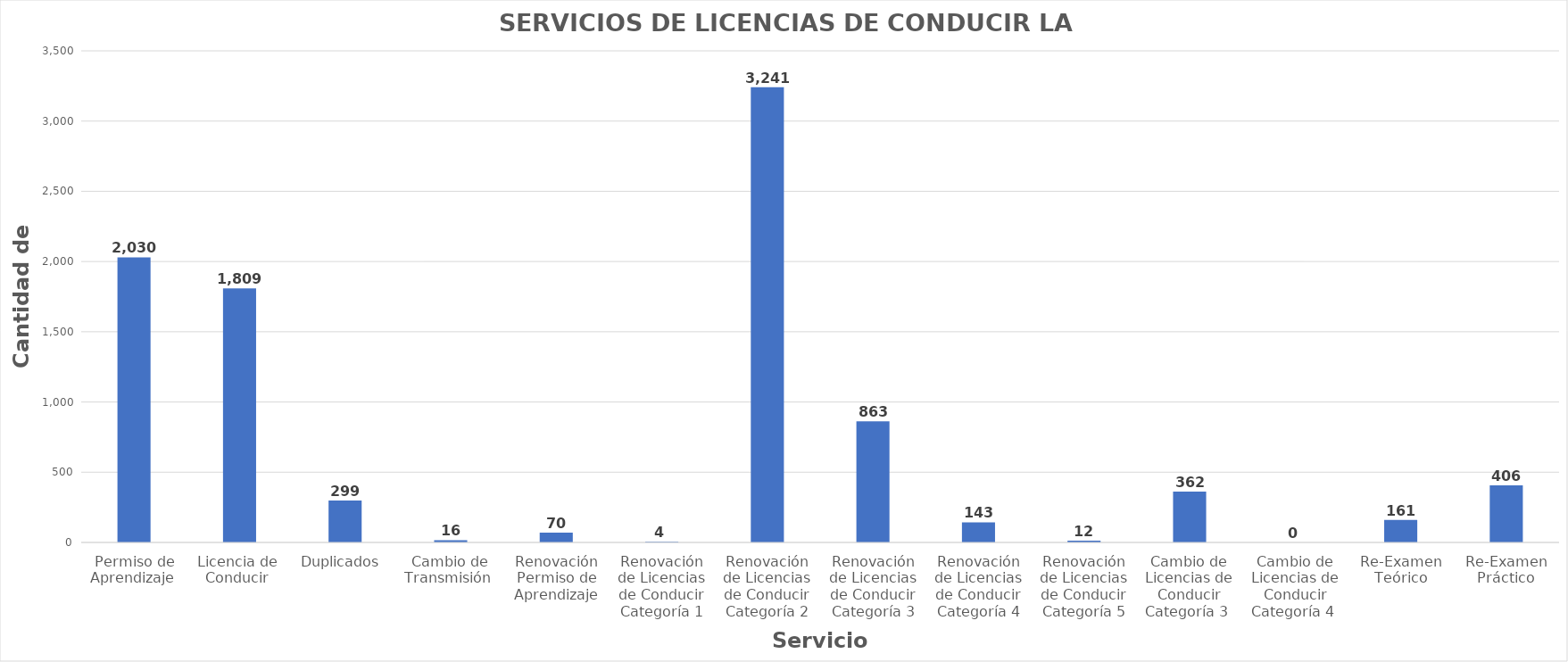
| Category | Series 0 |
|---|---|
| Permiso de Aprendizaje  | 2030 |
| Licencia de  Conducir  | 1809 |
| Duplicados  | 299 |
| Cambio de Transmisión  | 16 |
| Renovación Permiso de Aprendizaje | 70 |
| Renovación de Licencias de Conducir Categoría 1 | 4 |
| Renovación de Licencias de Conducir Categoría 2 | 3241 |
| Renovación de Licencias de Conducir Categoría 3 | 863 |
| Renovación de Licencias de Conducir Categoría 4 | 143 |
| Renovación de Licencias de Conducir Categoría 5 | 12 |
| Cambio de Licencias de Conducir Categoría 3  | 362 |
| Cambio de Licencias de Conducir Categoría 4  | 0 |
| Re-Examen Teórico | 161 |
| Re-Examen Práctico | 406 |